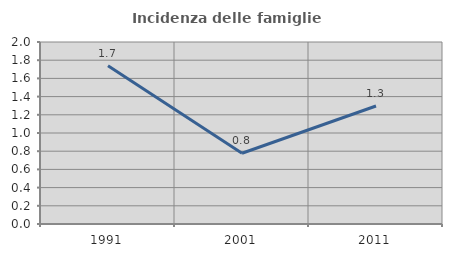
| Category | Incidenza delle famiglie numerose |
|---|---|
| 1991.0 | 1.739 |
| 2001.0 | 0.777 |
| 2011.0 | 1.297 |